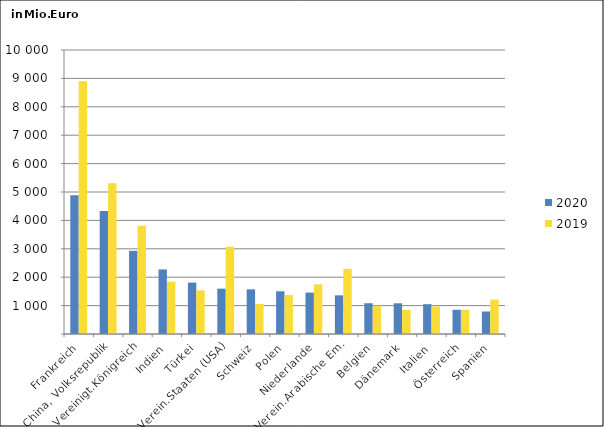
| Category | 2020 | 2019 |
|---|---|---|
| Frankreich | 4883.045 | 8899.132 |
| China, Volksrepublik | 4331.595 | 5304.27 |
| Vereinigt.Königreich | 2928.744 | 3813.749 |
| Indien | 2273.641 | 1839.932 |
| Türkei | 1810.829 | 1537.107 |
| Verein.Staaten (USA) | 1595.95 | 3070.753 |
| Schweiz | 1572.169 | 1055.772 |
| Polen | 1504.506 | 1371.108 |
| Niederlande | 1458.769 | 1748.527 |
| Verein.Arabische Em. | 1362.086 | 2295.078 |
| Belgien | 1083.852 | 993.919 |
| Dänemark | 1081.611 | 846.548 |
| Italien | 1049.686 | 970.839 |
| Österreich | 851.811 | 853.485 |
| Spanien | 791.959 | 1211.676 |